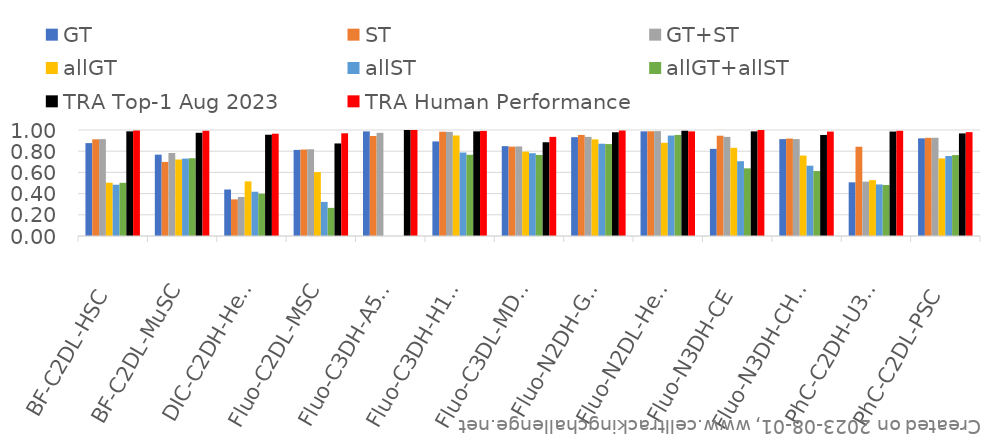
| Category | GT | ST | GT+ST | allGT | allST | allGT+allST | TRA Top-1 Aug 2023 | TRA Human Performance |
|---|---|---|---|---|---|---|---|---|
| BF-C2DL-HSC | 0.876 | 0.912 | 0.914 | 0.503 | 0.484 | 0.501 | 0.987 | 0.995 |
| BF-C2DL-MuSC | 0.767 | 0.699 | 0.783 | 0.722 | 0.73 | 0.734 | 0.974 | 0.993 |
| DIC-C2DH-HeLa | 0.439 | 0.345 | 0.368 | 0.515 | 0.418 | 0.399 | 0.955 | 0.965 |
| Fluo-C2DL-MSC | 0.812 | 0.816 | 0.818 | 0.603 | 0.322 | 0.265 | 0.873 | 0.969 |
| Fluo-C3DH-A549 | 0.987 | 0.943 | 0.974 | 0 | 0 | 0 | 1 | 1 |
| Fluo-C3DH-H157 | 0.892 | 0.984 | 0.982 | 0.948 | 0.788 | 0.766 | 0.987 | 0.991 |
| Fluo-C3DL-MDA231 | 0.848 | 0.843 | 0.845 | 0.796 | 0.781 | 0.765 | 0.884 | 0.935 |
| Fluo-N2DH-GOWT1 | 0.932 | 0.953 | 0.935 | 0.912 | 0.871 | 0.867 | 0.979 | 0.995 |
| Fluo-N2DL-HeLa | 0.987 | 0.988 | 0.989 | 0.879 | 0.948 | 0.953 | 0.993 | 0.987 |
| Fluo-N3DH-CE | 0.822 | 0.946 | 0.935 | 0.832 | 0.706 | 0.638 | 0.987 | 1 |
| Fluo-N3DH-CHO | 0.914 | 0.919 | 0.914 | 0.759 | 0.663 | 0.613 | 0.953 | 0.985 |
| PhC-C2DH-U373 | 0.507 | 0.842 | 0.513 | 0.527 | 0.486 | 0.481 | 0.985 | 0.992 |
| PhC-C2DL-PSC | 0.921 | 0.926 | 0.927 | 0.732 | 0.755 | 0.763 | 0.968 | 0.98 |